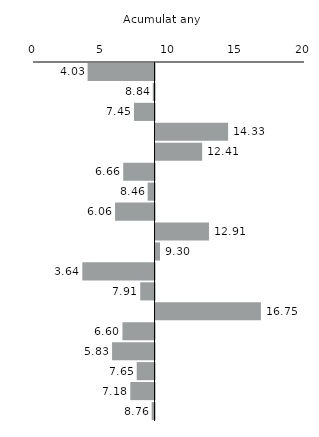
| Category | Series 0 |
|---|---|
| Andalusia | 4.028 |
| Aragó | 8.839 |
| Astúries | 7.453 |
| Balears | 14.326 |
| Canàries | 12.411 |
| Cantàbria | 6.659 |
| Castella i Lleó | 8.462 |
| Castella - la Manxa | 6.057 |
| Catalunya | 12.912 |
| Com. Valenciana | 9.299 |
| Extremadura | 3.642 |
| Galícia | 7.913 |
| Madrid | 16.746 |
| Múrcia | 6.601 |
| Navarra | 5.835 |
| País Basc | 7.653 |
| La Rioja | 7.182 |
| Ceuta i Melilla | 8.758 |